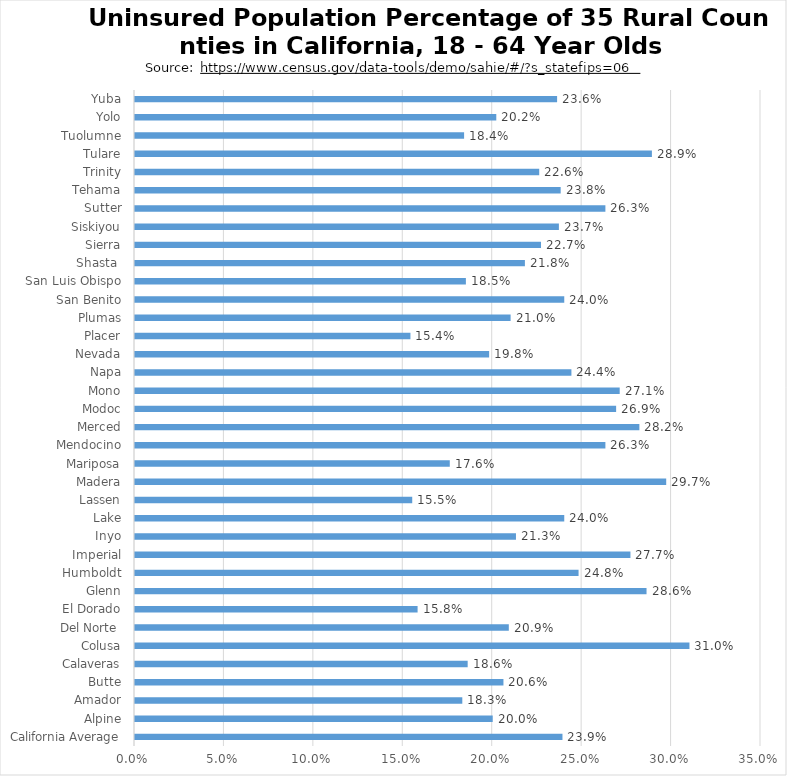
| Category | % Uninsured |
|---|---|
| California Average | 0.239 |
| Alpine | 0.2 |
| Amador | 0.183 |
| Butte | 0.206 |
| Calaveras | 0.186 |
| Colusa | 0.31 |
| Del Norte  | 0.209 |
| El Dorado | 0.158 |
| Glenn | 0.286 |
| Humboldt | 0.248 |
| Imperial | 0.277 |
| Inyo | 0.213 |
| Lake | 0.24 |
| Lassen | 0.155 |
| Madera | 0.297 |
| Mariposa | 0.176 |
| Mendocino | 0.263 |
| Merced | 0.282 |
| Modoc | 0.269 |
| Mono | 0.271 |
| Napa | 0.244 |
| Nevada | 0.198 |
| Placer | 0.154 |
| Plumas | 0.21 |
| San Benito | 0.24 |
| San Luis Obispo | 0.185 |
| Shasta  | 0.218 |
| Sierra | 0.227 |
| Siskiyou | 0.237 |
| Sutter | 0.263 |
| Tehama | 0.238 |
| Trinity | 0.226 |
| Tulare | 0.289 |
| Tuolumne | 0.184 |
| Yolo | 0.202 |
| Yuba | 0.236 |